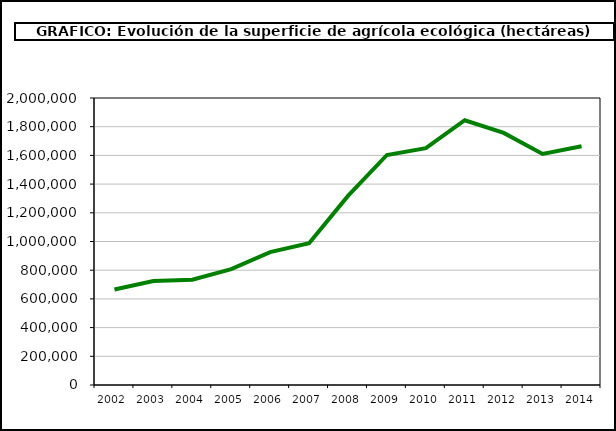
| Category | Superficie (ha) |
|---|---|
| 2002.0 | 665055 |
| 2003.0 | 725254 |
| 2004.0 | 733182 |
| 2005.0 | 807569 |
| 2006.0 | 926390 |
| 2007.0 | 988323 |
| 2008.0 | 1317752 |
| 2009.0 | 1602868 |
| 2010.0 | 1650866 |
| 2011.0 | 1845039 |
| 2012.0 | 1756548 |
| 2013.0 | 1610128.662 |
| 2014.0 | 1663189.163 |